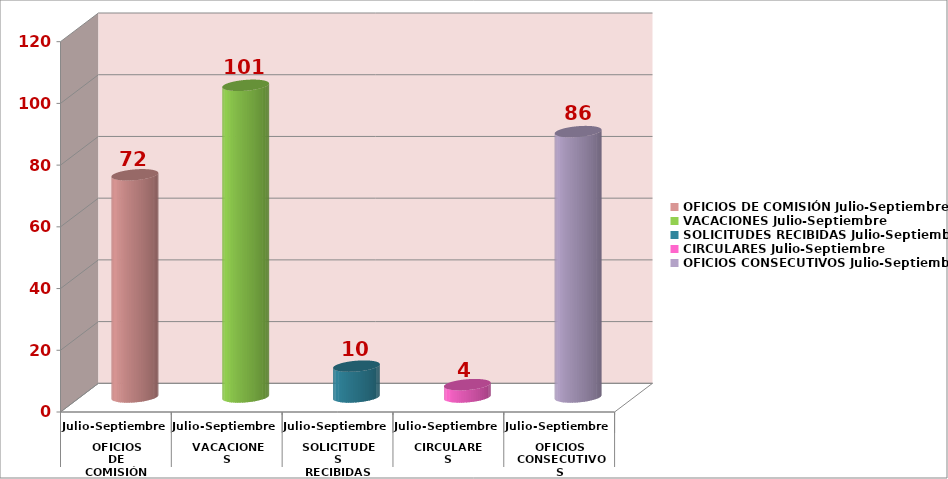
| Category | Series 0 |
|---|---|
| 0 | 72 |
| 1 | 101 |
| 2 | 10 |
| 3 | 4 |
| 4 | 86 |